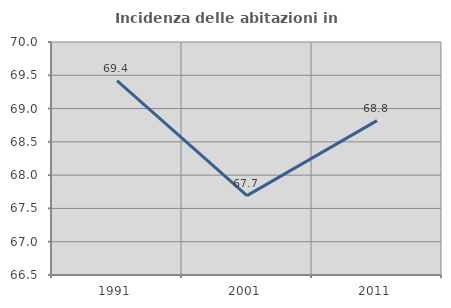
| Category | Incidenza delle abitazioni in proprietà  |
|---|---|
| 1991.0 | 69.421 |
| 2001.0 | 67.692 |
| 2011.0 | 68.819 |